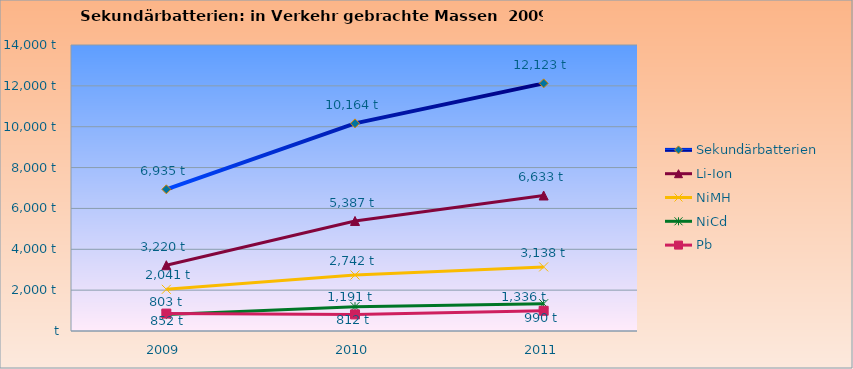
| Category | Sekundärbatterien | Li-Ion | NiMH | NiCd | Pb |
|---|---|---|---|---|---|
| 2009.0 | 6934.662 | 3219.889 | 2041.312 | 803.46 | 852.001 |
| 2010.0 | 10163.899 | 5386.666 | 2741.794 | 1191.129 | 811.906 |
| 2011.0 | 12122.74 | 6633.105 | 3137.643 | 1335.867 | 990.476 |